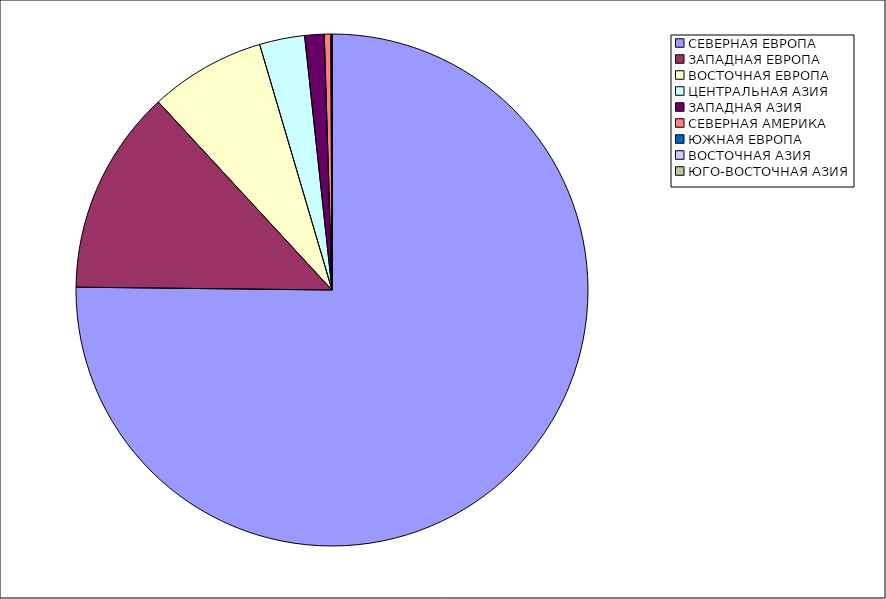
| Category | Оборот |
|---|---|
| СЕВЕРНАЯ ЕВРОПА | 75.17 |
| ЗАПАДНАЯ ЕВРОПА | 12.95 |
| ВОСТОЧНАЯ ЕВРОПА | 7.31 |
| ЦЕНТРАЛЬНАЯ АЗИЯ | 2.85 |
| ЗАПАДНАЯ АЗИЯ | 1.23 |
| СЕВЕРНАЯ АМЕРИКА | 0.41 |
| ЮЖНАЯ ЕВРОПА | 0.04 |
| ВОСТОЧНАЯ АЗИЯ | 0.03 |
| ЮГО-ВОСТОЧНАЯ АЗИЯ | 0 |